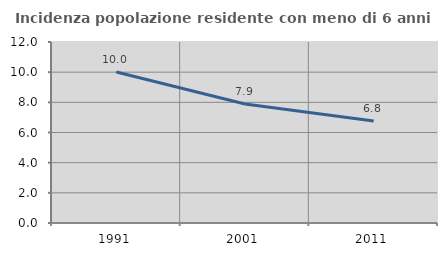
| Category | Incidenza popolazione residente con meno di 6 anni |
|---|---|
| 1991.0 | 10.01 |
| 2001.0 | 7.893 |
| 2011.0 | 6.766 |